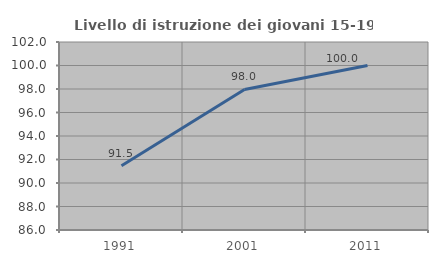
| Category | Livello di istruzione dei giovani 15-19 anni |
|---|---|
| 1991.0 | 91.463 |
| 2001.0 | 97.959 |
| 2011.0 | 100 |